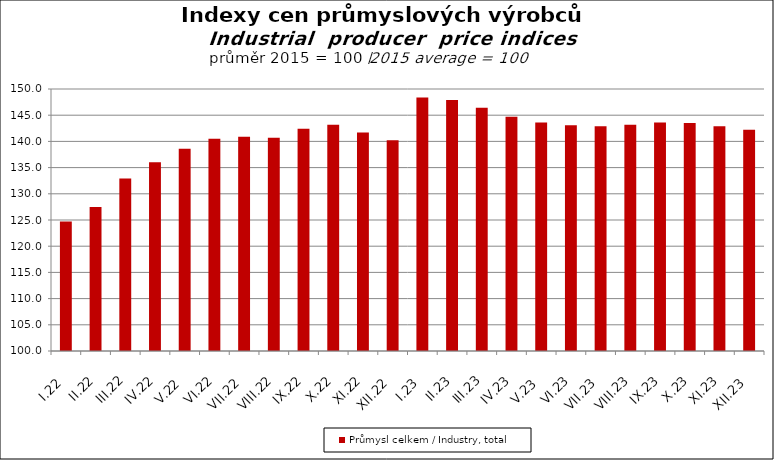
| Category | Průmysl celkem / Industry, total |
|---|---|
| I.22 | 124.7 |
| II.22 | 127.5 |
| III.22 | 132.9 |
| IV.22 | 136 |
| V.22 | 138.6 |
| VI.22 | 140.5 |
| VII.22 | 140.9 |
| VIII.22 | 140.7 |
| IX.22 | 142.4 |
| X.22 | 143.2 |
| XI.22 | 141.7 |
| XII.22 | 140.2 |
| I.23 | 148.4 |
| II.23 | 147.9 |
| III.23 | 146.4 |
| IV.23 | 144.7 |
| V.23 | 143.6 |
| VI.23 | 143.1 |
| VII.23 | 142.9 |
| VIII.23 | 143.2 |
| IX.23 | 143.6 |
| X.23 | 143.5 |
| XI.23 | 142.9 |
| XII.23 | 142.2 |